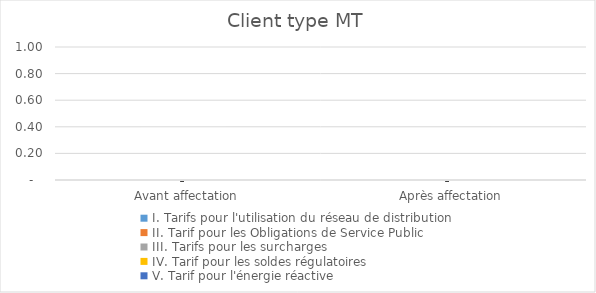
| Category | I. Tarifs pour l'utilisation du réseau de distribution | II. Tarif pour les Obligations de Service Public  | III. Tarifs pour les surcharges   | IV. Tarif pour les soldes régulatoires | V. Tarif pour l'énergie réactive |
|---|---|---|---|---|---|
| Avant affectation | 0 | 0 | 0 | 0 | 0 |
| Après affectation | 0 | 0 | 0 | 0 | 0 |